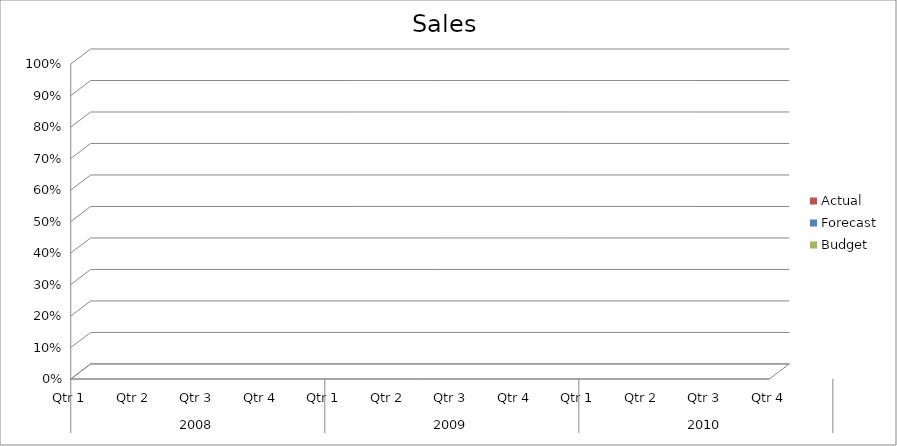
| Category | Budget | Forecast | Actual |
|---|---|---|---|
| 0 | 530 | 3350 | 1150 |
| 1 | 2690 | 760 | 2650 |
| 2 | 3360 | 2990 | 920 |
| 3 | 1470 | 2110 | 2370 |
| 4 | 3300 | 1650 | 1530 |
| 5 | 1800 | 2260 | 2430 |
| 6 | 3270 | 2400 | 2860 |
| 7 | 2440 | 1190 | 1120 |
| 8 | 1810 | 1680 | 910 |
| 9 | 3040 | 800 | 2310 |
| 10 | 2340 | 2080 | 1180 |
| 11 | 3110 | 3340 | 1040 |